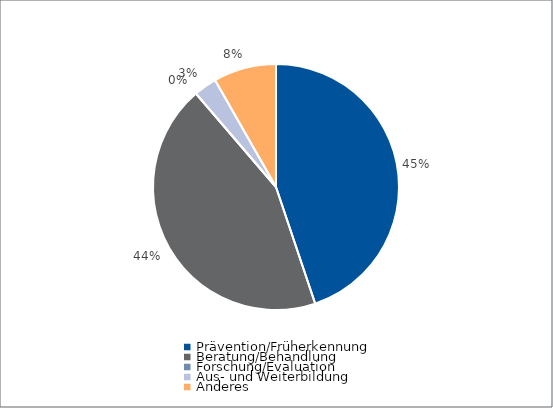
| Category | Series 0 |
|---|---|
| Prävention/Früherkennung | 29646 |
| Beratung/Behandlung | 29016 |
| Forschung/Evaluation | 0 |
| Aus- und Weiterbildung | 2000 |
| Anderes | 5455 |